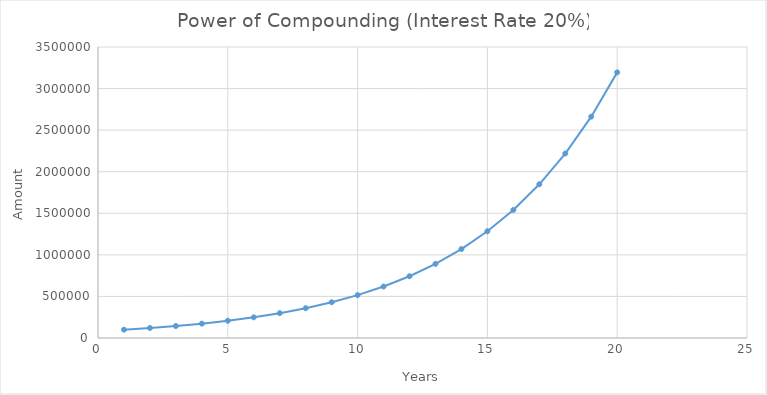
| Category | Principal |
|---|---|
| 1.0 | 100000 |
| 2.0 | 120000 |
| 3.0 | 144000 |
| 4.0 | 172800 |
| 5.0 | 207360 |
| 6.0 | 248832 |
| 7.0 | 298598.4 |
| 8.0 | 358318.08 |
| 9.0 | 429981.696 |
| 10.0 | 515978.035 |
| 11.0 | 619173.642 |
| 12.0 | 743008.371 |
| 13.0 | 891610.045 |
| 14.0 | 1069932.054 |
| 15.0 | 1283918.465 |
| 16.0 | 1540702.157 |
| 17.0 | 1848842.589 |
| 18.0 | 2218611.107 |
| 19.0 | 2662333.328 |
| 20.0 | 3194799.994 |